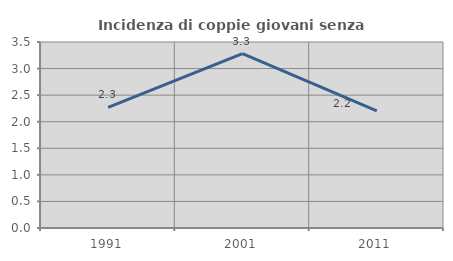
| Category | Incidenza di coppie giovani senza figli |
|---|---|
| 1991.0 | 2.269 |
| 2001.0 | 3.281 |
| 2011.0 | 2.205 |